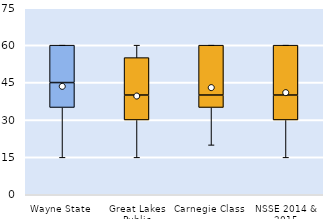
| Category | 25th | 50th | 75th |
|---|---|---|---|
| Wayne State | 35 | 10 | 15 |
| Great Lakes Public | 30 | 10 | 15 |
| Carnegie Class | 35 | 5 | 20 |
| NSSE 2014 & 2015 | 30 | 10 | 20 |